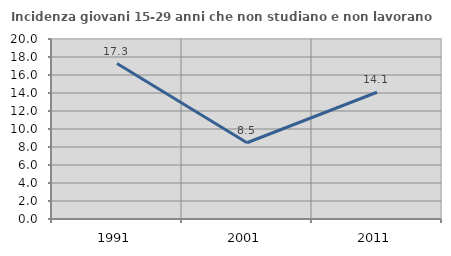
| Category | Incidenza giovani 15-29 anni che non studiano e non lavorano  |
|---|---|
| 1991.0 | 17.273 |
| 2001.0 | 8.475 |
| 2011.0 | 14.082 |